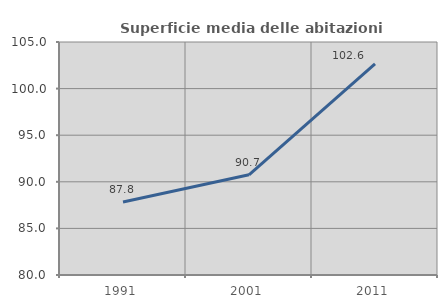
| Category | Superficie media delle abitazioni occupate |
|---|---|
| 1991.0 | 87.84 |
| 2001.0 | 90.749 |
| 2011.0 | 102.645 |